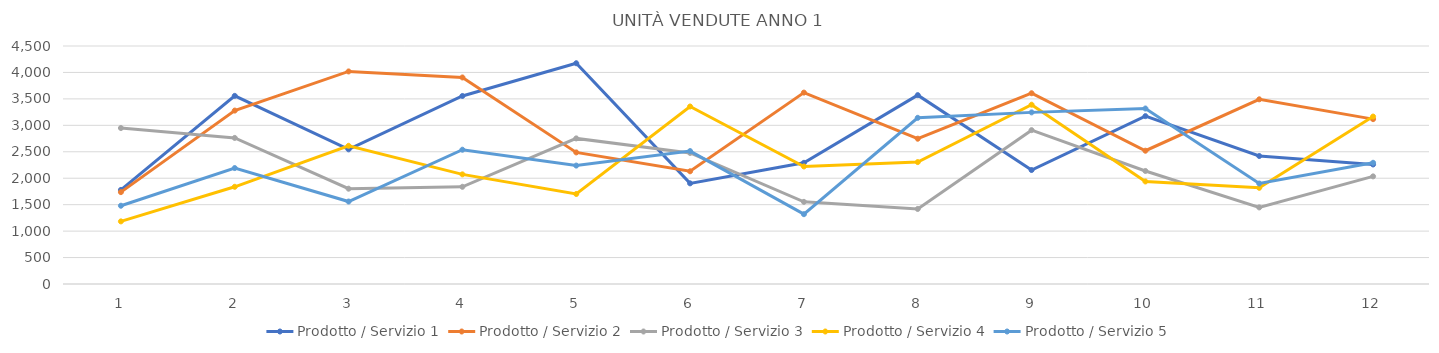
| Category | Prodotto / Servizio 1 | Prodotto / Servizio 2 | Prodotto / Servizio 3 | Prodotto / Servizio 4 | Prodotto / Servizio 5 |
|---|---|---|---|---|---|
| 0 | 1779 | 1737 | 2949 | 1184 | 1480 |
| 1 | 3557 | 3279 | 2762 | 1838 | 2192 |
| 2 | 2546 | 4019 | 1802 | 2613 | 1559 |
| 3 | 3555 | 3905 | 1838 | 2073 | 2539 |
| 4 | 4174 | 2488 | 2753 | 1702 | 2239 |
| 5 | 1903 | 2131 | 2478 | 3356 | 2513 |
| 6 | 2291 | 3619 | 1553 | 2222 | 1320 |
| 7 | 3571 | 2747 | 1419 | 2305 | 3142 |
| 8 | 2155 | 3607 | 2909 | 3390 | 3245 |
| 9 | 3174 | 2520 | 2137 | 1939 | 3318 |
| 10 | 2420 | 3492 | 1448 | 1819 | 1900 |
| 11 | 2260 | 3117 | 2035 | 3166 | 2292 |